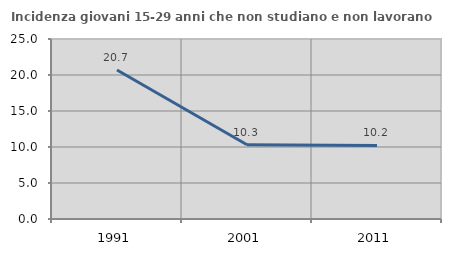
| Category | Incidenza giovani 15-29 anni che non studiano e non lavorano  |
|---|---|
| 1991.0 | 20.685 |
| 2001.0 | 10.309 |
| 2011.0 | 10.219 |